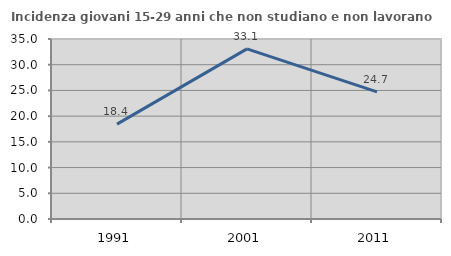
| Category | Incidenza giovani 15-29 anni che non studiano e non lavorano  |
|---|---|
| 1991.0 | 18.439 |
| 2001.0 | 33.077 |
| 2011.0 | 24.719 |